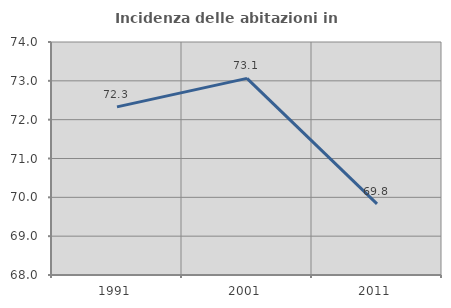
| Category | Incidenza delle abitazioni in proprietà  |
|---|---|
| 1991.0 | 72.329 |
| 2001.0 | 73.063 |
| 2011.0 | 69.832 |